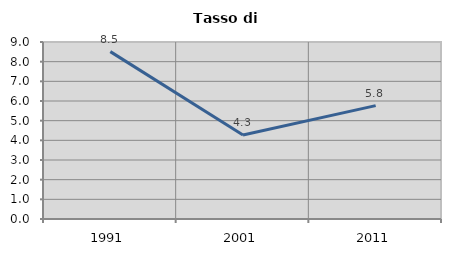
| Category | Tasso di disoccupazione   |
|---|---|
| 1991.0 | 8.511 |
| 2001.0 | 4.267 |
| 2011.0 | 5.767 |